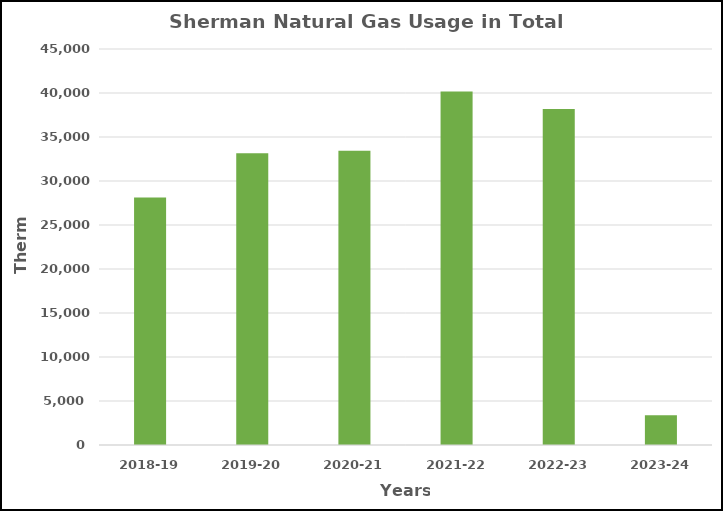
| Category | Series 0 |
|---|---|
| 2018-19 | 28119 |
| 2019-20 | 33165 |
| 2020-21 | 33430 |
| 2021-22 | 40172 |
| 2022-23 | 38188 |
| 2023-24 | 3376 |